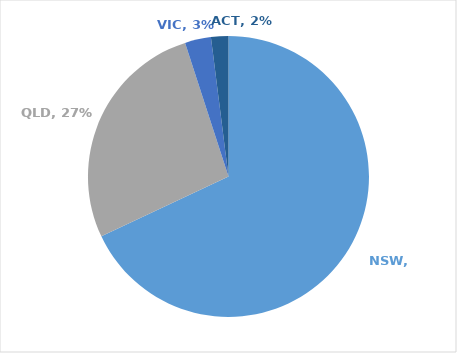
| Category | Series 0 |
|---|---|
| NSW | 0.68 |
| QLD | 0.27 |
| VIC | 0.03 |
| ACT | 0.02 |